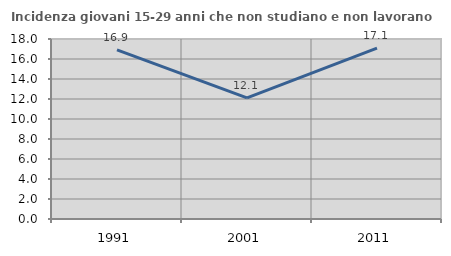
| Category | Incidenza giovani 15-29 anni che non studiano e non lavorano  |
|---|---|
| 1991.0 | 16.911 |
| 2001.0 | 12.109 |
| 2011.0 | 17.084 |